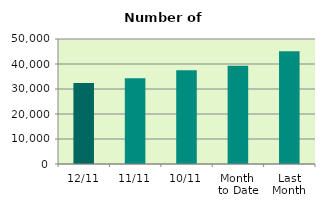
| Category | Series 0 |
|---|---|
| 12/11 | 32386 |
| 11/11 | 34342 |
| 10/11 | 37544 |
| Month 
to Date | 39266.4 |
| Last
Month | 45060.857 |